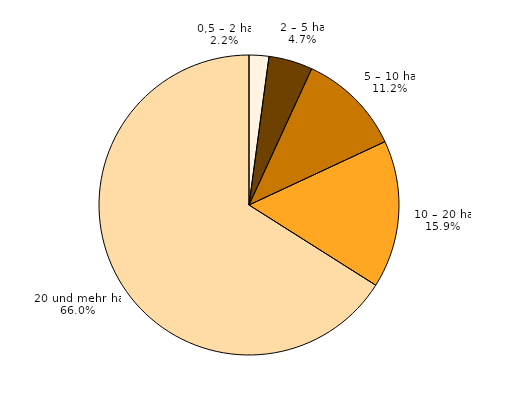
| Category | Series 0 |
|---|---|
| 0,5 – 2 ha | 33 |
| 2 – 5 ha | 73 |
| 5 – 10 ha | 173 |
| 10 – 20 ha | 246 |
| 20 und mehr ha | 1020 |